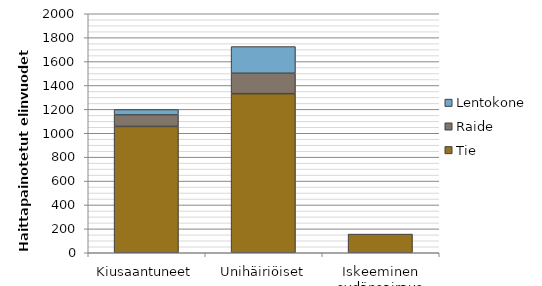
| Category | Tie | Raide | Lentokone |
|---|---|---|---|
| Kiusaantuneet | 1057.188 | 96.031 | 45.387 |
| Unihäiriöiset | 1331.467 | 170.595 | 223.513 |
| Iskeeminen sydänsairaus | 156.289 | 0 | 0 |